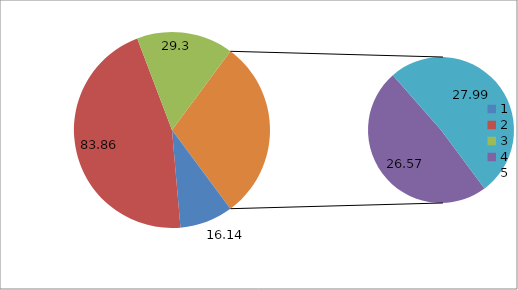
| Category | Series 0 |
|---|---|
| 0 | 16.14 |
| 1 | 83.86 |
| 2 | 29.3 |
| 3 | 26.57 |
| 4 | 27.99 |